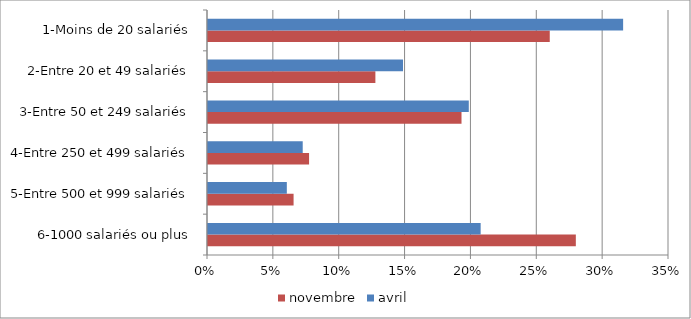
| Category | novembre | avril |
|---|---|---|
| 6-1000 salariés ou plus | 0.279 | 0.207 |
| 5-Entre 500 et 999 salariés | 0.065 | 0.06 |
| 4-Entre 250 et 499 salariés | 0.077 | 0.072 |
| 3-Entre 50 et 249 salariés | 0.192 | 0.198 |
| 2-Entre 20 et 49 salariés | 0.127 | 0.148 |
| 1-Moins de 20 salariés | 0.259 | 0.315 |